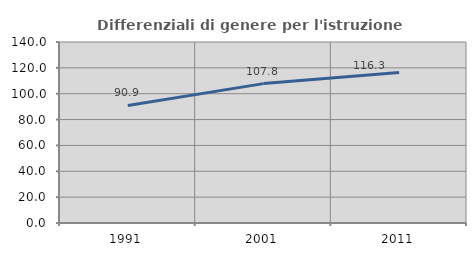
| Category | Differenziali di genere per l'istruzione superiore |
|---|---|
| 1991.0 | 90.939 |
| 2001.0 | 107.808 |
| 2011.0 | 116.342 |